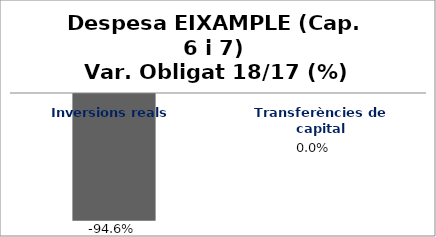
| Category | Series 0 |
|---|---|
| Inversions reals | -0.946 |
| Transferències de capital | 0 |